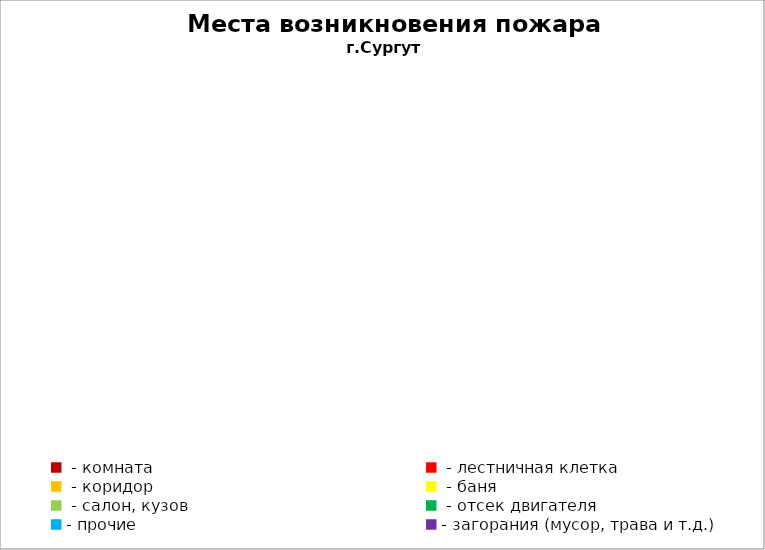
| Category | Места возникновения пожара |
|---|---|
|  - комната | 31 |
|  - лестничная клетка | 7 |
|  - коридор | 7 |
|  - баня | 15 |
|  - салон, кузов | 5 |
|  - отсек двигателя | 28 |
| - прочие | 45 |
| - загорания (мусор, трава и т.д.)  | 39 |